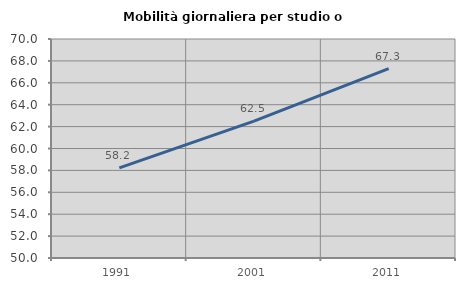
| Category | Mobilità giornaliera per studio o lavoro |
|---|---|
| 1991.0 | 58.23 |
| 2001.0 | 62.498 |
| 2011.0 | 67.285 |